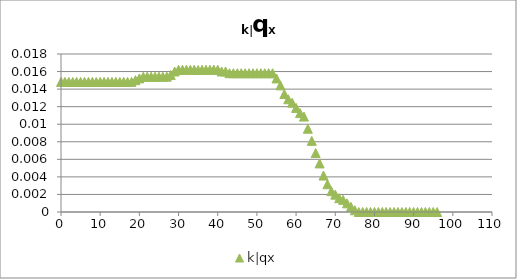
| Category | k|qx |
|---|---|
| 0.0 | 0.015 |
| 1.0 | 0.015 |
| 2.0 | 0.015 |
| 3.0 | 0.015 |
| 4.0 | 0.015 |
| 5.0 | 0.015 |
| 6.0 | 0.015 |
| 7.0 | 0.015 |
| 8.0 | 0.015 |
| 9.0 | 0.015 |
| 10.0 | 0.015 |
| 11.0 | 0.015 |
| 12.0 | 0.015 |
| 13.0 | 0.015 |
| 14.0 | 0.015 |
| 15.0 | 0.015 |
| 16.0 | 0.015 |
| 17.0 | 0.015 |
| 18.0 | 0.015 |
| 19.0 | 0.015 |
| 20.0 | 0.015 |
| 21.0 | 0.015 |
| 22.0 | 0.015 |
| 23.0 | 0.015 |
| 24.0 | 0.015 |
| 25.0 | 0.015 |
| 26.0 | 0.015 |
| 27.0 | 0.015 |
| 28.0 | 0.016 |
| 29.0 | 0.016 |
| 30.0 | 0.016 |
| 31.0 | 0.016 |
| 32.0 | 0.016 |
| 33.0 | 0.016 |
| 34.0 | 0.016 |
| 35.0 | 0.016 |
| 36.0 | 0.016 |
| 37.0 | 0.016 |
| 38.0 | 0.016 |
| 39.0 | 0.016 |
| 40.0 | 0.016 |
| 41.0 | 0.016 |
| 42.0 | 0.016 |
| 43.0 | 0.016 |
| 44.0 | 0.016 |
| 45.0 | 0.016 |
| 46.0 | 0.016 |
| 47.0 | 0.016 |
| 48.0 | 0.016 |
| 49.0 | 0.016 |
| 50.0 | 0.016 |
| 51.0 | 0.016 |
| 52.0 | 0.016 |
| 53.0 | 0.016 |
| 54.0 | 0.016 |
| 55.0 | 0.015 |
| 56.0 | 0.014 |
| 57.0 | 0.013 |
| 58.0 | 0.013 |
| 59.0 | 0.012 |
| 60.0 | 0.012 |
| 61.0 | 0.011 |
| 62.0 | 0.011 |
| 63.0 | 0.009 |
| 64.0 | 0.008 |
| 65.0 | 0.007 |
| 66.0 | 0.006 |
| 67.0 | 0.004 |
| 68.0 | 0.003 |
| 69.0 | 0.002 |
| 70.0 | 0.002 |
| 71.0 | 0.002 |
| 72.0 | 0.001 |
| 73.0 | 0.001 |
| 74.0 | 0.001 |
| 75.0 | 0 |
| 76.0 | 0 |
| 77.0 | 0 |
| 78.0 | 0 |
| 79.0 | 0 |
| 80.0 | 0 |
| 81.0 | 0 |
| 82.0 | 0 |
| 83.0 | 0 |
| 84.0 | 0 |
| 85.0 | 0 |
| 86.0 | 0 |
| 87.0 | 0 |
| 88.0 | 0 |
| 89.0 | 0 |
| 90.0 | 0 |
| 91.0 | 0 |
| 92.0 | 0 |
| 93.0 | 0 |
| 94.0 | 0 |
| 95.0 | 0 |
| 96.0 | 0 |